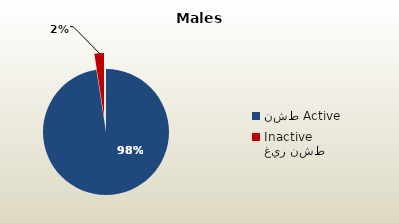
| Category | الذكور غير القطريين  Non-Qatari Males |
|---|---|
| نشط Active | 1778330 |
| غير نشط Inactive | 44590 |